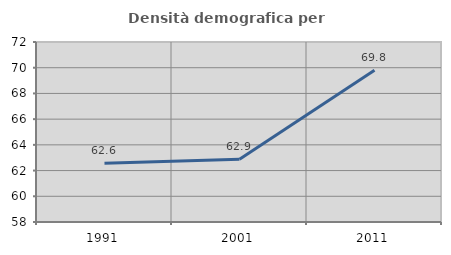
| Category | Densità demografica |
|---|---|
| 1991.0 | 62.576 |
| 2001.0 | 62.884 |
| 2011.0 | 69.806 |